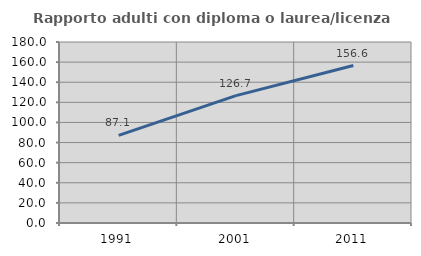
| Category | Rapporto adulti con diploma o laurea/licenza media  |
|---|---|
| 1991.0 | 87.087 |
| 2001.0 | 126.709 |
| 2011.0 | 156.614 |